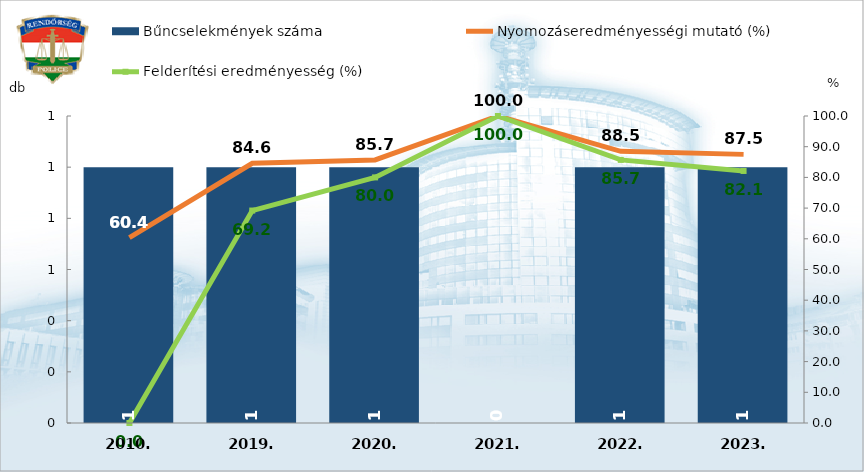
| Category | Bűncselekmények száma |
|---|---|
| 2010. | 1 |
| 2019. | 1 |
| 2020. | 1 |
| 2021. | 0 |
| 2022. | 1 |
| 2023. | 1 |